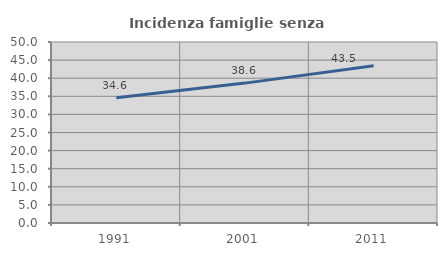
| Category | Incidenza famiglie senza nuclei |
|---|---|
| 1991.0 | 34.628 |
| 2001.0 | 38.643 |
| 2011.0 | 43.454 |